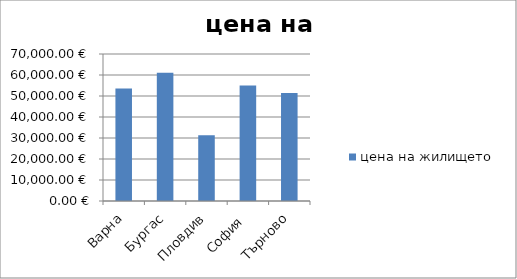
| Category | цена на жилището  |
|---|---|
| Варна | 53600 |
| Бургас | 61090 |
| Пловдив | 31280 |
| София | 55000 |
| Търново | 51410 |